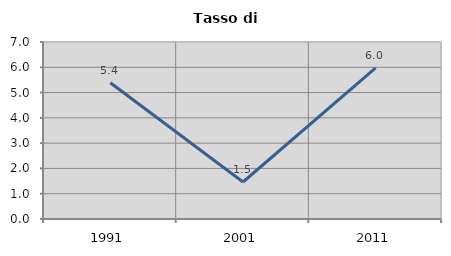
| Category | Tasso di disoccupazione   |
|---|---|
| 1991.0 | 5.389 |
| 2001.0 | 1.463 |
| 2011.0 | 5.978 |